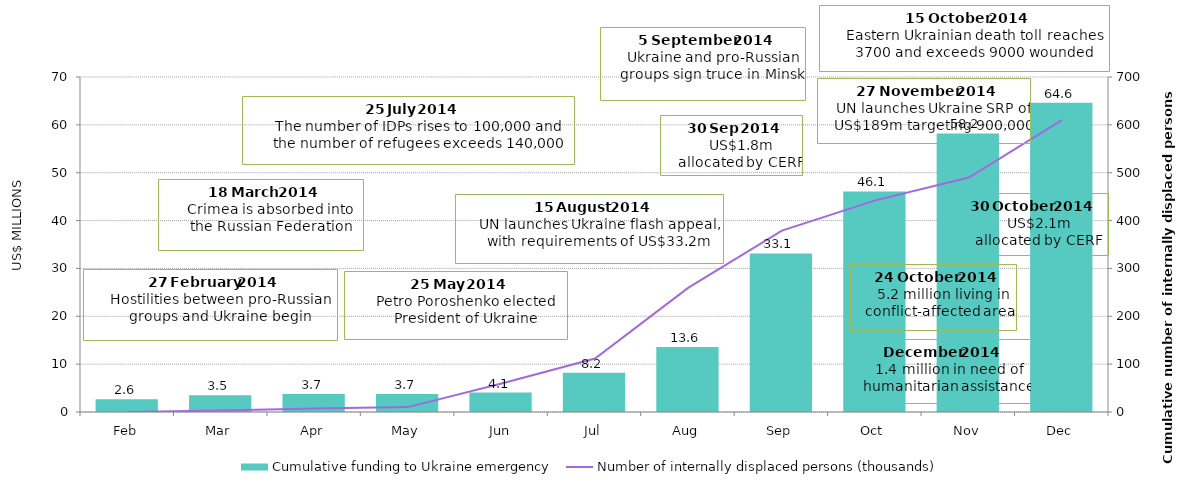
| Category | Cumulative funding to Ukraine emergency |
|---|---|
| Feb | 2.64 |
| Mar | 3.524 |
| Apr | 3.737 |
| May | 3.737 |
| Jun | 4.051 |
| Jul | 8.214 |
| Aug | 13.558 |
| Sep | 33.128 |
| Oct | 46.095 |
| Nov | 58.217 |
| Dec | 64.616 |